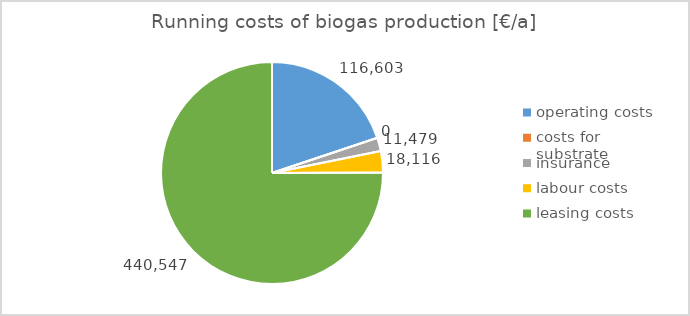
| Category | Series 0 |
|---|---|
| operating costs | 116603.379 |
| costs for substrate | 0 |
| insurance | 11479 |
| labour costs | 18116 |
| leasing costs | 440547.148 |